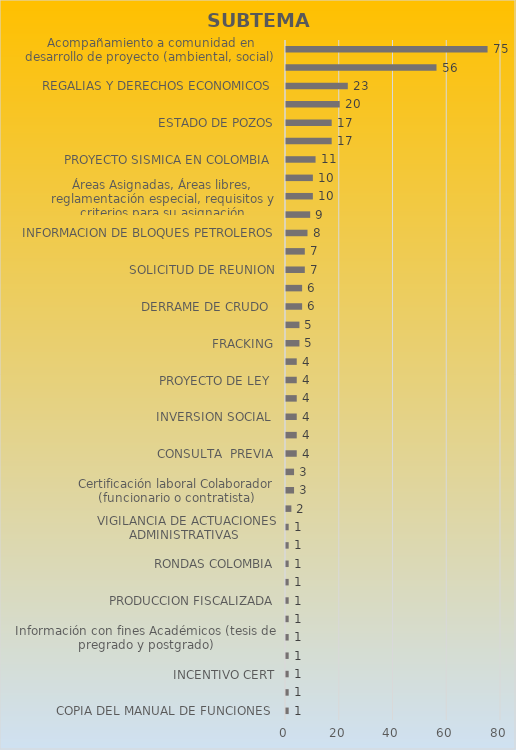
| Category | CANTIDAD |
|---|---|
| COPIA DEL MANUAL DE FUNCIONES  | 1 |
| Historias laborales | 1 |
| INCENTIVO CERT | 1 |
| INCUMPLIMIENTO DE SENTENCIAS  | 1 |
| Información con fines Académicos (tesis de pregrado y postgrado) | 1 |
| LIQUIDACION DE CONTRATOS | 1 |
| PRODUCCION FISCALIZADA | 1 |
| RESTITUCION DE TIERRAS | 1 |
| RONDAS COLOMBIA | 1 |
| SOLICITUD DE INCUMPLIMIENTO  | 1 |
| VIGILANCIA DE ACTUACIONES ADMINISTRATIVAS  | 1 |
| VULNERABILIDAD DE LOS DERECHOS LABORALES  | 2 |
| Certificación laboral Colaborador (funcionario o contratista) | 3 |
| Intervención para que operador vincule personal | 3 |
| CONSULTA  PREVIA | 4 |
| INTERVENSION PARA QUE LA OPERADORAS CUMPLAN CON SUS COMPROMISOS | 4 |
| INVERSION SOCIAL  | 4 |
| PROBABLE EXISTENCIA DE YACIMIENTO PETROLERO  | 4 |
| PROYECTO DE LEY  | 4 |
| SERVIDUMBRES PETROELRAS  | 4 |
| FRACKING | 5 |
| IMPACTOS Y PLANES DE MANEJO AMBIENTAL, LICENCIAS, COMPROMISOS E&P, NORMATIVIDAD CONTAMINACION  | 5 |
| DERRAME DE CRUDO  | 6 |
| EJECUCION PRESUPUESTAL  | 6 |
| SOLICITUD DE REUNION | 7 |
| VACANTES EN DEFINITIVA ANH | 7 |
| INFORMACION DE BLOQUES PETROLEROS | 8 |
| Cifras oficiales de producción en el país (producción, precio, demanda, Columnas Estratigráficas | 9 |
| Áreas Asignadas, Áreas libres, reglamentación especial, requisitos y criterios para su asignación | 10 |
| CARTOGRAFIA ZONAS PETROLERAS | 10 |
| PROYECTO SISMICA EN COLOMBIA  | 11 |
| COPIA DE CONTRATOS | 17 |
| ESTADO DE POZOS | 17 |
| CONTRATOS DE EXPLORACION Y EXPLOTACION  | 20 |
| REGALIAS Y DERECHOS ECONOMICOS  | 23 |
| Actividad Hidrocarburífera en regiones del país | 56 |
| Acompañamiento a comunidad en desarrollo de proyecto (ambiental, social) | 75 |